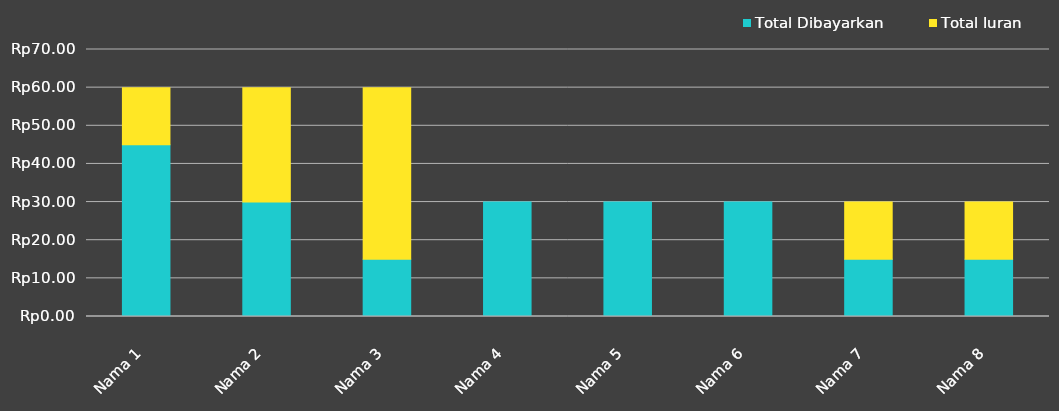
| Category | Total Dibayarkan | Total Iuran |
|---|---|---|
| Nama 1 | 45 | 15 |
| Nama 2 | 30 | 30 |
| Nama 3 | 15 | 45 |
| Nama 4 | 30 | 0 |
| Nama 5 | 30 | 0 |
| Nama 6 | 30 | 0 |
| Nama 7 | 15 | 15 |
| Nama 8 | 15 | 15 |